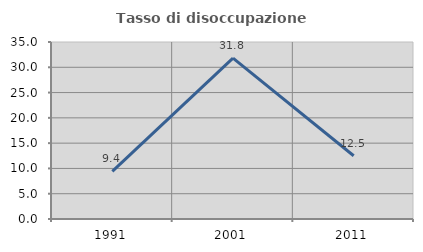
| Category | Tasso di disoccupazione giovanile  |
|---|---|
| 1991.0 | 9.434 |
| 2001.0 | 31.818 |
| 2011.0 | 12.5 |